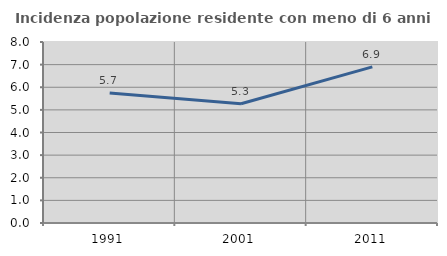
| Category | Incidenza popolazione residente con meno di 6 anni |
|---|---|
| 1991.0 | 5.741 |
| 2001.0 | 5.274 |
| 2011.0 | 6.899 |